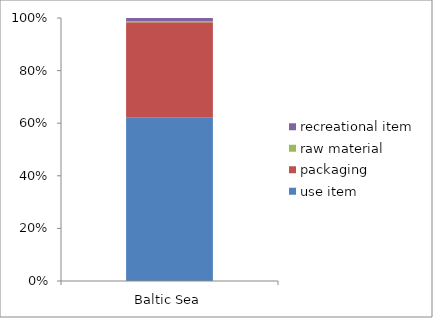
| Category | use item | packaging | raw material | recreational item |
|---|---|---|---|---|
| Baltic Sea | 13193 | 7646 | 105 | 246 |